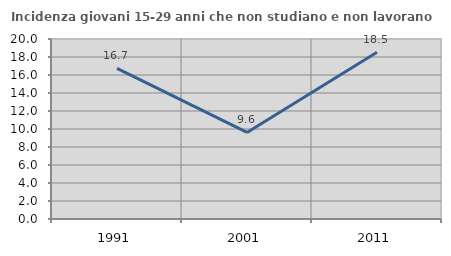
| Category | Incidenza giovani 15-29 anni che non studiano e non lavorano  |
|---|---|
| 1991.0 | 16.728 |
| 2001.0 | 9.615 |
| 2011.0 | 18.519 |